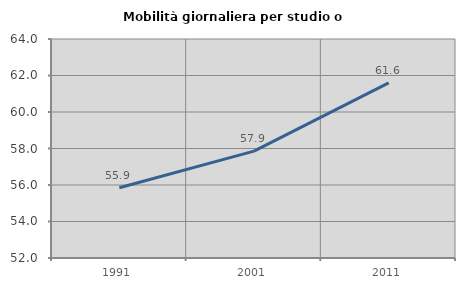
| Category | Mobilità giornaliera per studio o lavoro |
|---|---|
| 1991.0 | 55.851 |
| 2001.0 | 57.857 |
| 2011.0 | 61.6 |